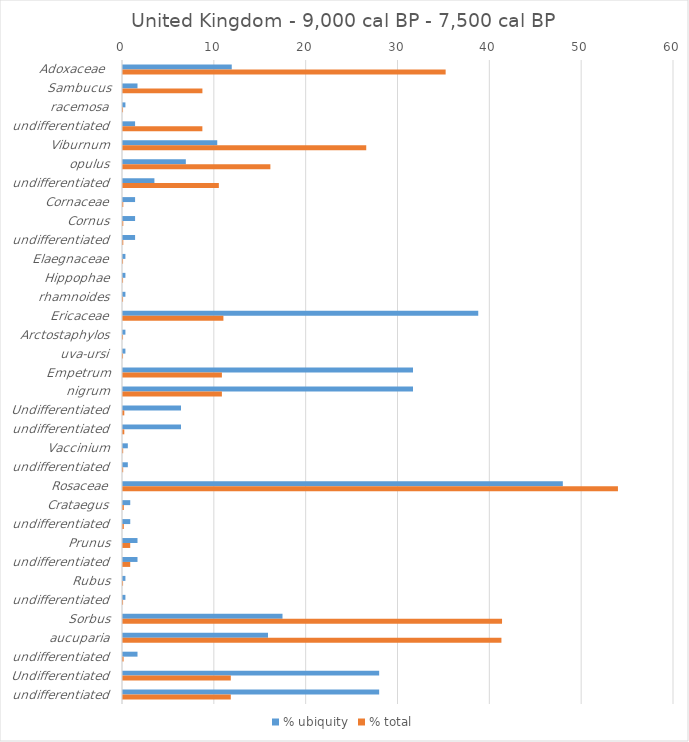
| Category | % ubiquity | % total |
|---|---|---|
| Adoxaceae  | 11.842 | 35.134 |
| Sambucus | 1.579 | 8.647 |
| racemosa | 0.263 | 0.004 |
| undifferentiated | 1.316 | 8.643 |
| Viburnum | 10.263 | 26.487 |
| opulus | 6.842 | 16.048 |
| undifferentiated | 3.421 | 10.438 |
| Cornaceae | 1.316 | 0.03 |
| Cornus | 1.316 | 0.03 |
| undifferentiated | 1.316 | 0.03 |
| Elaegnaceae | 0.263 | 0.006 |
| Hippophae | 0.263 | 0.006 |
| rhamnoides | 0.263 | 0.006 |
| Ericaceae | 38.684 | 10.934 |
| Arctostaphylos | 0.263 | 0.005 |
| uva-ursi | 0.263 | 0.005 |
| Empetrum | 31.579 | 10.769 |
| nigrum | 31.579 | 10.769 |
| Undifferentiated | 6.316 | 0.141 |
| undifferentiated | 6.316 | 0.141 |
| Vaccinium | 0.526 | 0.018 |
| undifferentiated | 0.526 | 0.018 |
| Rosaceae | 47.895 | 53.896 |
| Crataegus | 0.789 | 0.09 |
| undifferentiated | 0.789 | 0.09 |
| Prunus | 1.579 | 0.786 |
| undifferentiated | 1.579 | 0.786 |
| Rubus | 0.263 | 0.007 |
| undifferentiated | 0.263 | 0.007 |
| Sorbus | 17.368 | 41.275 |
| aucuparia | 15.789 | 41.208 |
| undifferentiated | 1.579 | 0.066 |
| Undifferentiated | 27.895 | 11.739 |
| undifferentiated | 27.895 | 11.739 |